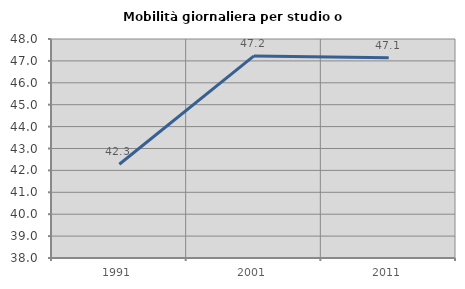
| Category | Mobilità giornaliera per studio o lavoro |
|---|---|
| 1991.0 | 42.282 |
| 2001.0 | 47.226 |
| 2011.0 | 47.14 |